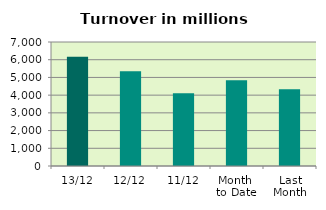
| Category | Series 0 |
|---|---|
| 13/12 | 6164.627 |
| 12/12 | 5344.314 |
| 11/12 | 4111.186 |
| Month 
to Date | 4842.357 |
| Last
Month | 4332.538 |